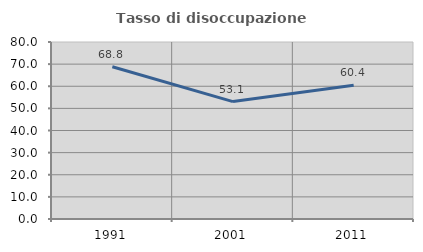
| Category | Tasso di disoccupazione giovanile  |
|---|---|
| 1991.0 | 68.786 |
| 2001.0 | 53.061 |
| 2011.0 | 60.417 |